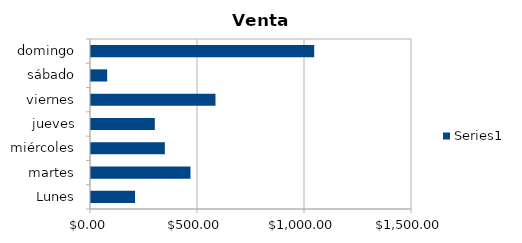
| Category | Series 0 |
|---|---|
| Lunes | 205.8 |
| martes | 464.8 |
| miércoles | 345.1 |
| jueves | 298.2 |
| viernes | 581.7 |
| sábado | 75.6 |
| domingo | 1043 |